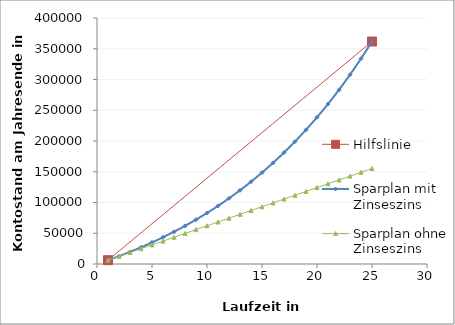
| Category | Hilfslinie |
|---|---|
| 1.0 | 6211.25 |
| 25.0 | 361747.248 |